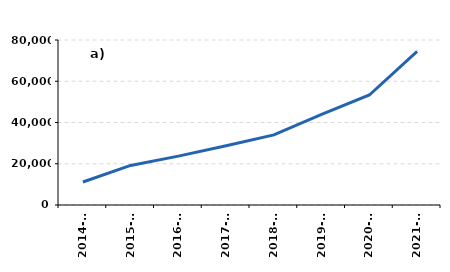
| Category | ASHP |
|---|---|
| 2014-15 | 11132 |
| 2015-16 | 19174 |
| 2016-17 | 23692 |
| 2017-18 | 28695 |
| 2018-19 | 33979 |
| 2019-20 | 43963 |
| 2020-21 | 53329 |
| 2021-22 | 74446 |